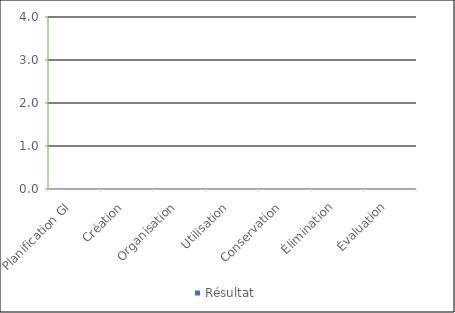
| Category | Résultat |
|---|---|
| Planification GI | 0 |
| Création | 0 |
| Organisation | 0 |
| Utilisation | 0 |
| Conservation | 0 |
| Élimination | 0 |
| Évaluation | 0 |